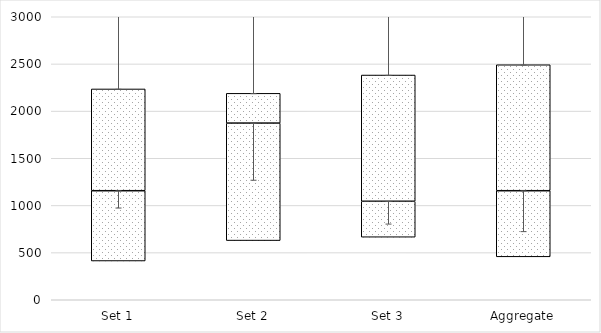
| Category | Q1 | Median-Q1 | Q3-Median |
|---|---|---|---|
| Set 1 | 410.676 | 745.241 | 1078.788 |
| Set 2 | 627.243 | 1245.501 | 315.518 |
| Set 3 | 663.131 | 380.859 | 1338.295 |
| Aggregate | 455.033 | 700.883 | 1335.093 |